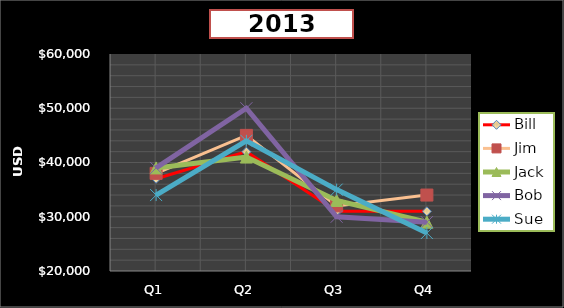
| Category | Bill | Jim | Jack | Bob | Sue |
|---|---|---|---|---|---|
| Q1 | 37000 | 38000 | 39000 | 39000 | 34000 |
| Q2 | 42000 | 45000 | 41000 | 50000 | 44000 |
| Q3 | 31000 | 32000 | 33000 | 30000 | 35000 |
| Q4 | 31000 | 34000 | 29000 | 29000 | 27000 |